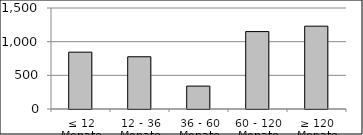
| Category | Volumen |
|---|---|
| ≤ 12 Monate | 844071842.17 |
| 12 - 36 Monate | 775949325.77 |
| 36 - 60 Monate | 340132055.7 |
| 60 - 120 Monate | 1149784497.17 |
| ≥ 120 Monate | 1229915444.482 |